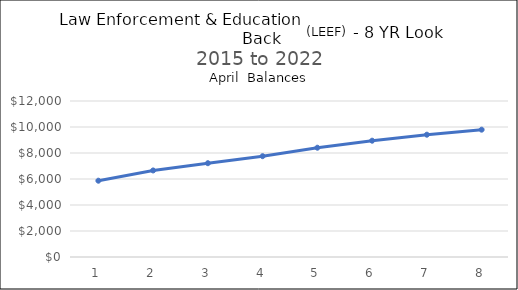
| Category | Law EEF |
|---|---|
| 0 | 5869.39 |
| 1 | 6657.39 |
| 2 | 7215.17 |
| 3 | 7755.17 |
| 4 | 8406.17 |
| 5 | 8946.17 |
| 6 | 9407.82 |
| 7 | 9794.47 |